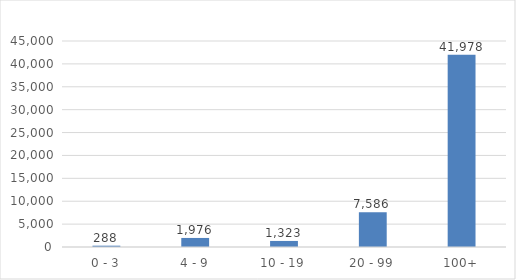
| Category | Employees (000s)  |
|---|---|
| 0 - 3 | 288.2 |
| 4 - 9 | 1975.7 |
| 10 - 19 | 1323.3 |
| 20 - 99 | 7585.9 |
| 100+ | 41978 |